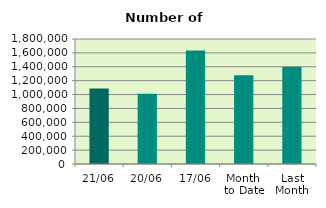
| Category | Series 0 |
|---|---|
| 21/06 | 1086516 |
| 20/06 | 1010282 |
| 17/06 | 1632664 |
| Month 
to Date | 1278510.533 |
| Last
Month | 1401172.455 |